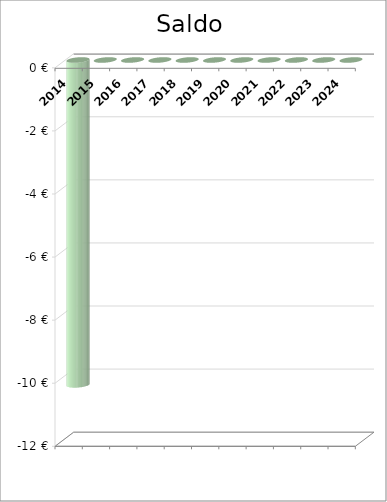
| Category | Saldo |
|---|---|
| 2014.0 | -10.3 |
| 2015.0 | 0 |
| 2016.0 | 0 |
| 2017.0 | 0 |
| 2018.0 | 0 |
| 2019.0 | 0 |
| 2020.0 | 0 |
| 2021.0 | 0 |
| 2022.0 | 0 |
| 2023.0 | 0 |
| 2024.0 | 0 |